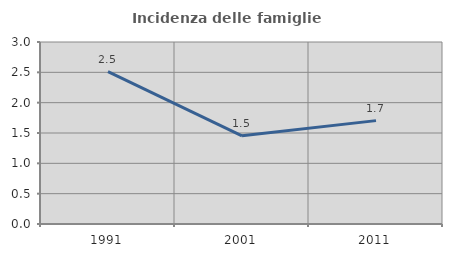
| Category | Incidenza delle famiglie numerose |
|---|---|
| 1991.0 | 2.513 |
| 2001.0 | 1.454 |
| 2011.0 | 1.704 |